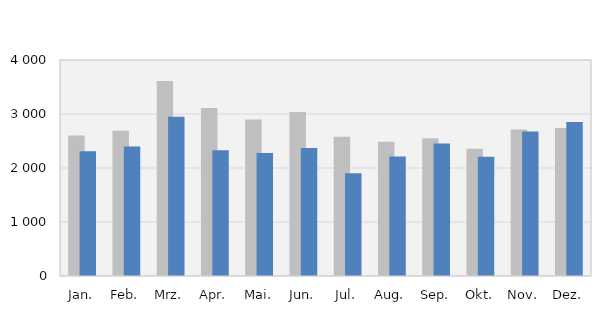
| Category | 2021 | 2022 |
|---|---|---|
| Jan. | 2604 | 2308 |
| Feb. | 2690 | 2398 |
| Mrz. | 3610 | 2951 |
| Apr. | 3111 | 2328 |
| Mai. | 2900 | 2276 |
| Jun. | 3039 | 2370 |
| Jul. | 2579 | 1905 |
| Aug. | 2487 | 2212 |
| Sep. | 2551 | 2455 |
| Okt. | 2355 | 2210 |
| Nov. | 2714 | 2675 |
| Dez. | 2740 | 2854 |